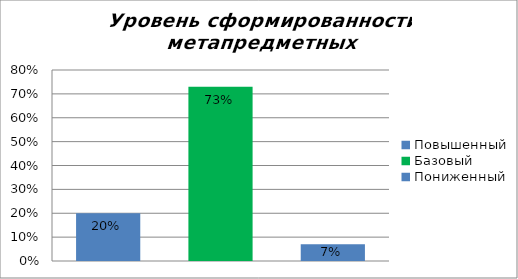
| Category | Уровень сформированности метапредметных результатов |
|---|---|
| Повышенный | 0.2 |
| Базовый | 0.73 |
| Пониженный | 0.07 |